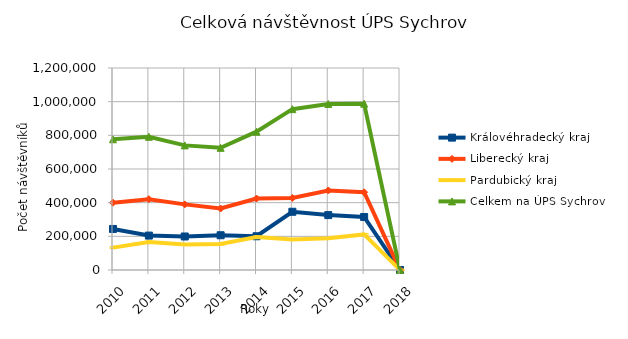
| Category | Královéhradecký kraj | Liberecký kraj | Pardubický kraj | Celkem na ÚPS Sychrov |
|---|---|---|---|---|
| 2010.0 | 243910 | 399672 | 133004 | 776586 |
| 2011.0 | 204481 | 420780 | 166238 | 791499 |
| 2012.0 | 199025 | 389781 | 151509 | 740315 |
| 2013.0 | 206419 | 365108 | 154165 | 725692 |
| 2014.0 | 200438 | 424718 | 196473 | 821629 |
| 2015.0 | 345970 | 428023 | 181567 | 955560 |
| 2016.0 | 326137 | 472318 | 188108 | 986563 |
| 2017.0 | 314983 | 461803 | 211268 | 988054 |
| 2018.0 | 0 | 0 | 0 | 0 |